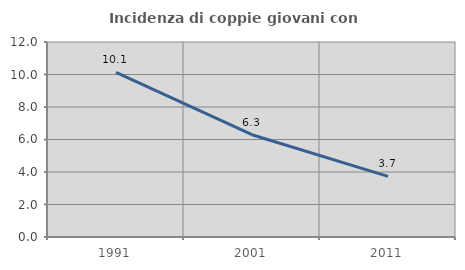
| Category | Incidenza di coppie giovani con figli |
|---|---|
| 1991.0 | 10.127 |
| 2001.0 | 6.294 |
| 2011.0 | 3.731 |